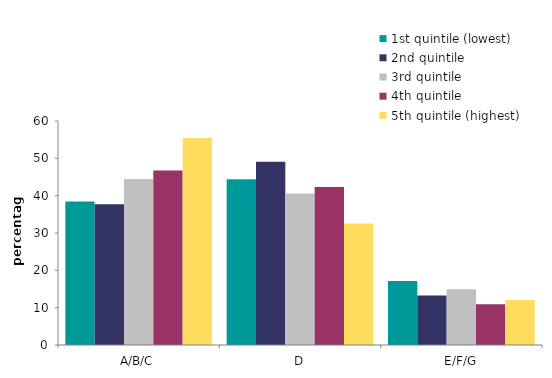
| Category | 1st quintile (lowest) | 2nd quintile | 3rd quintile | 4th quintile | 5th quintile (highest) |
|---|---|---|---|---|---|
| A/B/C | 38.423 | 37.67 | 44.491 | 46.744 | 55.416 |
| D | 44.405 | 49.087 | 40.608 | 42.336 | 32.553 |
| E/F/G | 17.172 | 13.243 | 14.901 | 10.92 | 12.031 |